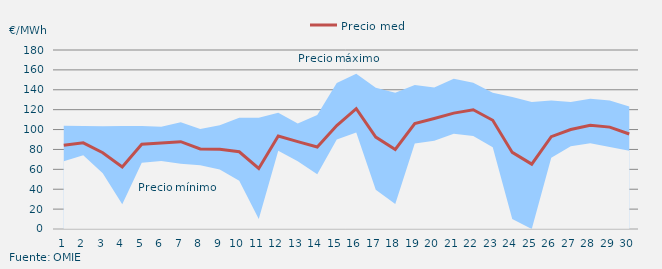
| Category | Precio medio |
|---|---|
| 1.0 | 84.165 |
| 2.0 | 86.679 |
| 3.0 | 76.732 |
| 4.0 | 62.414 |
| 5.0 | 85.253 |
| 6.0 | 86.563 |
| 7.0 | 87.77 |
| 8.0 | 80.479 |
| 9.0 | 80.206 |
| 10.0 | 77.685 |
| 11.0 | 60.92 |
| 12.0 | 93.439 |
| 13.0 | 87.911 |
| 14.0 | 82.461 |
| 15.0 | 104.042 |
| 16.0 | 120.976 |
| 17.0 | 92.457 |
| 18.0 | 79.93 |
| 19.0 | 105.941 |
| 20.0 | 111.1 |
| 21.0 | 116.547 |
| 22.0 | 119.874 |
| 23.0 | 109.316 |
| 24.0 | 77.018 |
| 25.0 | 65.213 |
| 26.0 | 92.841 |
| 27.0 | 100.03 |
| 28.0 | 104.234 |
| 29.0 | 102.448 |
| 30.0 | 95.569 |